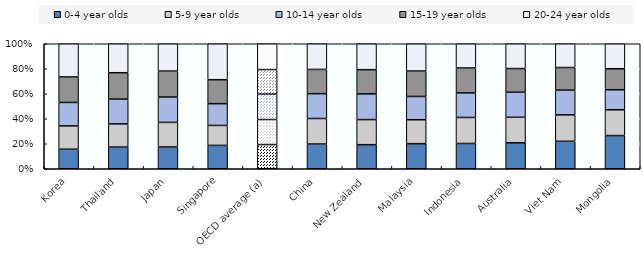
| Category | 0-4 year olds | 5-9 year olds | 10-14 year olds | 15-19 year olds | 20-24 year olds |
|---|---|---|---|---|---|
| Korea | 15.648 | 18.615 | 18.78 | 20.427 | 26.529 |
| Thailand | 17.339 | 18.533 | 19.835 | 21.111 | 23.182 |
| Japan | 17.412 | 19.682 | 20.276 | 20.779 | 21.851 |
| Singapore | 18.676 | 15.977 | 17.407 | 19.182 | 28.758 |
| OECD average (a) | 19.35 | 20.041 | 20.285 | 19.668 | 20.656 |
| China | 19.775 | 20.436 | 19.853 | 19.401 | 20.535 |
| New Zealand | 19.253 | 20.069 | 20.56 | 19.38 | 20.737 |
| Malaysia | 20.082 | 19.114 | 18.641 | 20.346 | 21.819 |
| Indonesia | 20.236 | 20.783 | 19.66 | 19.945 | 19.376 |
| Australia | 20.783 | 20.404 | 20.047 | 18.918 | 19.848 |
| Viet Nam | 21.986 | 21.132 | 19.773 | 18.109 | 18.999 |
| Mongolia | 26.551 | 20.632 | 16.032 | 16.805 | 19.994 |